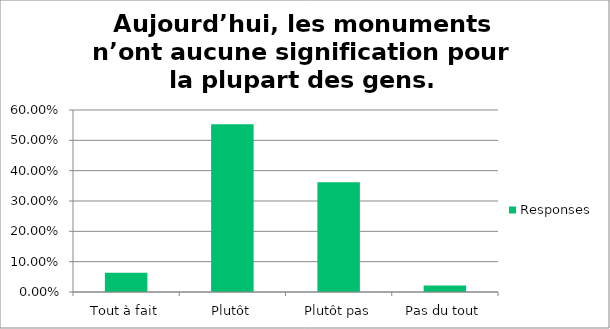
| Category | Responses |
|---|---|
| Tout à fait | 0.064 |
| Plutôt | 0.553 |
| Plutôt pas | 0.362 |
| Pas du tout | 0.021 |